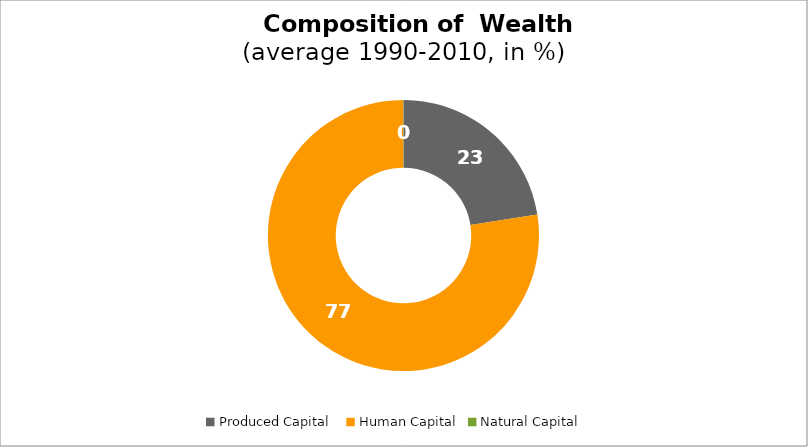
| Category | Series 0 |
|---|---|
| Produced Capital  | 22.537 |
| Human Capital | 77.422 |
| Natural Capital | 0.041 |